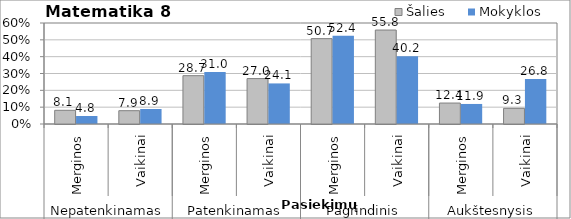
| Category | Šalies | Mokyklos |
|---|---|---|
| 0 | 8.134 | 4.762 |
| 1 | 7.907 | 8.929 |
| 2 | 28.708 | 30.952 |
| 3 | 26.977 | 24.107 |
| 4 | 50.718 | 52.381 |
| 5 | 55.814 | 40.179 |
| 6 | 12.44 | 11.905 |
| 7 | 9.302 | 26.786 |